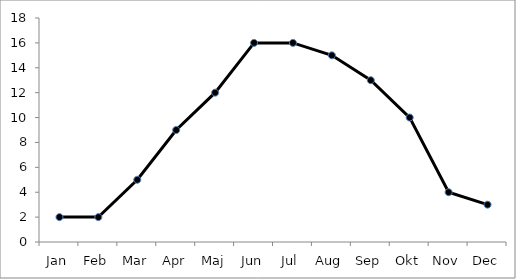
| Category | Series 0 |
|---|---|
| Jan | 2 |
| Feb | 2 |
| Mar | 5 |
| Apr | 9 |
| Maj | 12 |
| Jun | 16 |
| Jul | 16 |
| Aug | 15 |
| Sep | 13 |
| Okt | 10 |
| Nov | 4 |
| Dec | 3 |